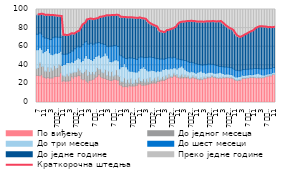
| Category | По виђењу  | До једног месеца  | До три месеца  | До шест месеци  | До једне године  | Преко једне године  |
|---|---|---|---|---|---|---|
| 7 | 28.901 | 7.538 | 20.318 | 16.513 | 21.086 | 5.635 |
| 8 | 28.993 | 8.638 | 19.197 | 16.611 | 20.966 | 5.594 |
| 9 | 28.645 | 13.978 | 16.331 | 15.658 | 20.26 | 5.128 |
| 10 | 29.783 | 9.095 | 18.198 | 16.32 | 21.492 | 5.128 |
| 11 | 27.404 | 11.55 | 14.425 | 17.426 | 23.487 | 5.716 |
| 12 | 26.887 | 6.935 | 21.065 | 14.581 | 24.185 | 6.347 |
| 1
2010. | 26.027 | 7.975 | 21.833 | 13.443 | 24.465 | 6.257 |
| 2 | 26.941 | 11.028 | 19.977 | 10.911 | 24.909 | 6.219 |
| 3 | 26.043 | 7.384 | 20.176 | 14.051 | 25.809 | 6.529 |
| 4 | 26.32 | 10.713 | 14.801 | 16.026 | 25.648 | 6.491 |
| 5 | 26.478 | 8.173 | 16.819 | 18.155 | 23.822 | 6.552 |
| 6 | 27.626 | 12.105 | 12.636 | 17.909 | 22.956 | 6.768 |
| 7
2010. | 27.874 | 8.428 | 17.006 | 17.039 | 22.647 | 7.014 |
| 8 | 28.022 | 9.585 | 15.225 | 17.296 | 22.723 | 7.14 |
| 9 | 28.274 | 12.39 | 13.026 | 16.415 | 22.549 | 7.336 |
| 10 | 31.825 | 8.282 | 15.051 | 14.74 | 22.549 | 7.553 |
| 11 | 22.732 | 6.945 | 9.979 | 12.399 | 20.356 | 27.589 |
| 12 | 23.353 | 5.165 | 12.223 | 11.235 | 20.307 | 27.71 |
| 1
2011. | 22.754 | 5.602 | 12.808 | 10.579 | 20.345 | 27.897 |
| 2 | 23.066 | 7.429 | 12.568 | 9.102 | 19.982 | 27.838 |
| 3 | 23.049 | 5.791 | 14.26 | 9.847 | 19.664 | 27.396 |
| 4 | 23.545 | 8.128 | 11.059 | 10.973 | 20.119 | 26.175 |
| 5 | 27.613 | 3.885 | 12.213 | 11.633 | 18.484 | 26.188 |
| 6 | 26.029 | 6.678 | 10.375 | 12.252 | 18.261 | 26.419 |
| 7
2011. | 28.21 | 4.209 | 13.098 | 12.364 | 17.106 | 25.019 |
| 8 | 27.733 | 5.329 | 13.376 | 12.922 | 16.674 | 23.973 |
| 9 | 29.107 | 7.817 | 11.216 | 12.325 | 16.169 | 23.367 |
| 10 | 28.744 | 5.56 | 12.693 | 12.55 | 20.285 | 20.175 |
| 11 | 25.439 | 7.22 | 11.201 | 16.255 | 23.048 | 16.837 |
| 12 | 24.335 | 6.773 | 14.1 | 16.895 | 22.371 | 15.521 |
| 1 
2012. | 25.318 | 8.164 | 14.349 | 16.778 | 21.172 | 14.22 |
| 2 | 23.026 | 12.531 | 14.984 | 14.946 | 23.539 | 10.975 |
| 3 | 21.736 | 7.361 | 18.474 | 15.39 | 26.226 | 10.813 |
| 4 | 23.532 | 9.83 | 14.03 | 15.285 | 27.115 | 10.213 |
| 5 | 24.032 | 6.223 | 16.027 | 17.367 | 25.946 | 10.406 |
| 6 | 24.662 | 8.629 | 11.93 | 16.755 | 27.121 | 10.908 |
| 7 
2012. | 25.262 | 5.074 | 17.016 | 15.592 | 26.651 | 10.41 |
| 8 | 27.084 | 6.185 | 16.064 | 14.55 | 26.124 | 9.992 |
| 9 | 28.071 | 9.521 | 12.497 | 13.789 | 26.337 | 9.79 |
| 10 | 29.725 | 5.803 | 15.517 | 13.344 | 27.305 | 8.305 |
| 11 | 27.739 | 8.403 | 12.066 | 15.131 | 28.405 | 8.255 |
| 12 | 26.642 | 5.905 | 17.226 | 13.488 | 28.945 | 7.794 |
| 1 
2013. | 25.96 | 5.968 | 18.439 | 12.173 | 29.901 | 7.56 |
| 2 | 25.853 | 9.739 | 17.541 | 9.217 | 30.897 | 6.759 |
| 3 | 24.711 | 4.254 | 21.868 | 9.593 | 32.835 | 6.739 |
| 4 | 24.536 | 9.372 | 13.892 | 12.117 | 33.415 | 6.674 |
| 5 | 23.775 | 4.398 | 15.884 | 16.495 | 32.862 | 6.585 |
| 6 | 23.709 | 9.567 | 10.417 | 16.761 | 33.029 | 6.518 |
| 7 
2013. | 24.436 | 3.983 | 16.282 | 16.314 | 32.61 | 6.375 |
| 8 | 24.88 | 4.515 | 16.416 | 15.445 | 32.444 | 6.3 |
| 9 | 24.427 | 10.902 | 10.679 | 15.569 | 32.261 | 6.162 |
| 10 | 23.838 | 4.948 | 16.084 | 15.38 | 33.211 | 6.538 |
| 11 | 19.061 | 8.95 | 8.324 | 14.775 | 40.676 | 8.207 |
| 12 | 18.573 | 4.342 | 15.419 | 11.903 | 41.435 | 8.327 |
| 1 
2014. | 17.055 | 5.14 | 16.572 | 10.247 | 42.398 | 8.588 |
| 2 | 17.17 | 9.427 | 15.126 | 6.46 | 43.154 | 8.663 |
| 3 | 17.076 | 3.559 | 17.818 | 8.975 | 43.8 | 8.774 |
| 4 | 16.758 | 8.149 | 11.021 | 11.172 | 44.037 | 8.862 |
| 5 | 17.893 | 2.956 | 13.123 | 14.112 | 43.097 | 8.819 |
| 6 | 17.633 | 7.774 | 8.234 | 14.155 | 43.269 | 8.935 |
| 7
2014. | 17.747 | 2.861 | 12.967 | 14.378 | 42.996 | 9.054 |
| 8 | 17.728 | 2.991 | 12.37 | 14.156 | 43.415 | 9.339 |
| 9 | 18.048 | 7.014 | 7.656 | 14.043 | 43.793 | 9.443 |
| 10 | 18.548 | 2.983 | 11.2 | 13.563 | 44.062 | 9.644 |
| 11 | 20.15 | 6.459 | 7.431 | 14.098 | 42.924 | 8.938 |
| 12 | 19.875 | 3.705 | 12.888 | 12.534 | 41.453 | 9.549 |
| 1 
2015. | 18.592 | 4.059 | 14.45 | 11.693 | 41.236 | 9.969 |
| 2 | 18.507 | 7.079 | 12.948 | 9.428 | 41.928 | 10.11 |
| 3 | 18.778 | 3.163 | 14.75 | 11.617 | 40.931 | 10.76 |
| 4 | 19.136 | 6.378 | 9.506 | 13.244 | 38.716 | 13.023 |
| 5 | 19.7 | 2.694 | 11.404 | 14.852 | 36.754 | 14.596 |
| 6 | 20.149 | 6.345 | 7.747 | 14.572 | 35.579 | 15.605 |
| 7
2015. | 20.745 | 2.744 | 11.369 | 13.754 | 34.861 | 16.527 |
| 8 | 21.088 | 2.877 | 10.485 | 14.024 | 34.224 | 17.302 |
| 9 | 21.01 | 5.473 | 7.604 | 13.841 | 34.068 | 18.006 |
| 10 | 20.729 | 2.558 | 9.852 | 13.944 | 34.023 | 18.897 |
| 11 | 22.679 | 4.626 | 6.703 | 13.37 | 30.353 | 22.27 |
| 12 | 22.82 | 1.711 | 9.023 | 12.993 | 29.552 | 23.902 |
| 1 
2016. | 23.451 | 1.818 | 8.732 | 12.796 | 29.163 | 24.042 |
| 2 | 23.937 | 4.134 | 7.649 | 10.961 | 28.542 | 24.773 |
| 3 | 23.645 | 1.711 | 10.192 | 10.958 | 29.036 | 24.46 |
| 4 | 24.715 | 4.049 | 7.742 | 10.673 | 30.16 | 22.662 |
| 5 | 25.753 | 1.487 | 8.684 | 11.944 | 29.605 | 22.529 |
| 6 | 26.45 | 3.886 | 5.806 | 11.853 | 30.131 | 21.874 |
| 7
2016. | 27.536 | 1.047 | 8.314 | 11.694 | 30.158 | 21.246 |
| 8 | 26.95 | 1.347 | 7.978 | 11.661 | 31.282 | 20.782 |
| 9 | 28.377 | 3.066 | 6.023 | 11.135 | 31.678 | 19.722 |
| 10 | 28.467 | 1.384 | 7.36 | 11.125 | 33.093 | 18.571 |
| 11 | 27.029 | 3.046 | 5.894 | 10.887 | 37.233 | 15.911 |
| 12 | 26.689 | 0.92 | 9.846 | 9.375 | 38.774 | 14.396 |
| 1 
2017. | 26.167 | 2.269 | 9.631 | 8.247 | 39.827 | 13.859 |
| 2 | 26.508 | 3.857 | 8.825 | 6.825 | 40.535 | 13.45 |
| 3 | 26.428 | 1.619 | 9.405 | 8.297 | 40.9 | 13.352 |
| 4 | 26.618 | 2.87 | 6.328 | 9.363 | 41.552 | 13.269 |
| 5 | 26.477 | 1.515 | 6.288 | 10.373 | 42.461 | 12.886 |
| 6 | 26.57 | 2.116 | 4.935 | 10.313 | 43.136 | 12.93 |
| 7
2017. | 25.618 | 0.768 | 6.362 | 10.31 | 44.257 | 12.685 |
| 8 | 26.475 | 0.836 | 6.193 | 9.805 | 43.924 | 12.767 |
| 9 | 26.638 | 2.073 | 4.242 | 9.746 | 44.354 | 12.947 |
| 10 | 26.242 | 0.895 | 5.264 | 9.729 | 44.805 | 13.065 |
| 11 | 25.596 | 1.982 | 3.91 | 10.071 | 44.924 | 13.517 |
| 12 | 25.244 | 0.644 | 6.707 | 8.537 | 45.536 | 13.332 |
| 1 
2018. | 24.559 | 0.971 | 7.629 | 7.643 | 45.857 | 13.341 |
| 2 | 24.567 | 2.02 | 7.344 | 6.613 | 46.054 | 13.402 |
| 3 | 24.696 | 0.658 | 7.153 | 7.423 | 46.386 | 13.685 |
| 4 | 25.594 | 1.919 | 4.915 | 8.275 | 45.886 | 13.412 |
| 5 | 25.804 | 0.604 | 5.058 | 9.11 | 46.168 | 13.256 |
| 6 | 26.252 | 1.71 | 3.9 | 8.969 | 46.031 | 13.138 |
| 7
2018. | 26.72 | 0.66 | 5.033 | 8.857 | 45.63 | 13.101 |
| 8 | 26.986 | 0.683 | 4.8 | 8.584 | 45.892 | 13.055 |
| 9 | 27.561 | 1.471 | 3.473 | 8.659 | 45.852 | 12.984 |
| 10 | 26.931 | 0.808 | 4.104 | 8.931 | 46.173 | 13.054 |
| 11 | 26.591 | 1.367 | 3.396 | 8.925 | 46.32 | 13.4 |
| 12 | 26.303 | 0.507 | 4.946 | 7.921 | 47.175 | 13.149 |
| 1 
2019. | 26.066 | 0.596 | 5.244 | 7.242 | 47.721 | 13.13 |
| 2 | 25.996 | 1.21 | 5.211 | 6.298 | 48.37 | 12.916 |
| 3 | 26.071 | 0.581 | 5.116 | 6.952 | 46.874 | 14.406 |
| 4 | 26.479 | 1.112 | 3.674 | 7.3 | 45.702 | 15.733 |
| 5 | 26.212 | 0.547 | 3.619 | 7.815 | 44.314 | 17.493 |
| 6 | 26.676 | 1.041 | 2.987 | 7.513 | 43.108 | 18.676 |
| 7
2019. | 26.719 | 0.542 | 3.378 | 7.398 | 42.005 | 19.958 |
| 8 | 26.427 | 0.567 | 3.359 | 7.312 | 41.501 | 20.835 |
| 9 | 26.324 | 0.944 | 2.79 | 7.207 | 41.118 | 21.616 |
| 10 | 25.726 | 0.527 | 3.298 | 7.207 | 40.228 | 23.013 |
| 11 | 24.433 | 1.048 | 2.859 | 7.155 | 38.49 | 26.015 |
| 12 | 23.821 | 0.491 | 3.235 | 7.242 | 36.948 | 28.264 |
| 1 
2020. | 23.492 | 0.581 | 3.383 | 6.977 | 36.437 | 29.131 |
| 2 | 23.666 | 1.036 | 3.338 | 5.995 | 35.904 | 30.06 |
| 3 | 24.114 | 0.413 | 3.744 | 5.878 | 36.575 | 29.276 |
| 4 | 25.71 | 0.819 | 3.052 | 5.599 | 36.329 | 28.49 |
| 5 | 25.878 | 0.386 | 2.879 | 6.327 | 37.206 | 27.324 |
| 6 | 25.833 | 0.899 | 2.63 | 6.102 | 37.907 | 26.629 |
| 7 
2020. | 26.253 | 0.402 | 2.974 | 6.139 | 38.682 | 25.549 |
| 8 | 26.429 | 0.433 | 2.959 | 6.009 | 39.57 | 24.6 |
| 9 | 26.957 | 0.834 | 2.375 | 6.06 | 40.041 | 23.733 |
| 10 | 26.791 | 0.412 | 2.61 | 6.318 | 40.75 | 23.119 |
| 11 | 26.785 | 1.046 | 2.283 | 6.425 | 41.786 | 21.675 |
| 12 | 26.623 | 0.401 | 3.543 | 6.028 | 43.181 | 20.224 |
| 1 
2021. | 26.592 | 0.421 | 3.918 | 5.725 | 43.929 | 19.416 |
| 2 | 26.463 | 0.997 | 3.909 | 5.214 | 44.786 | 18.632 |
| 3 | 26.479 | 0.398 | 3.674 | 5.686 | 45.127 | 18.636 |
| 4 | 26.439 | 0.672 | 2.805 | 6.178 | 45.361 | 18.544 |
| 5 | 26.723 | 0.438 | 2.304 | 6.63 | 45.15 | 18.755 |
| 6 | 27.09 | 0.703 | 1.865 | 6.233 | 45.325 | 18.784 |
| 7 
2021. | 27.851 | 0.499 | 2.095 | 6.078 | 44.266 | 19.21 |
| 8 | 28.113 | 0.304 | 2.109 | 5.833 | 44.133 | 19.508 |
| 9 | 28.817 | 0.572 | 1.691 | 5.518 | 43.999 | 19.403 |
| 10 | 28.617 | 0.345 | 1.837 | 5.796 | 43.816 | 19.589 |
| 11 | 30.128 | 0.488 | 1.523 | 5.64 | 42.965 | 19.255 |
| 12 | 30.149 | 0.261 | 2.203 | 5.05 | 43.191 | 19.145 |